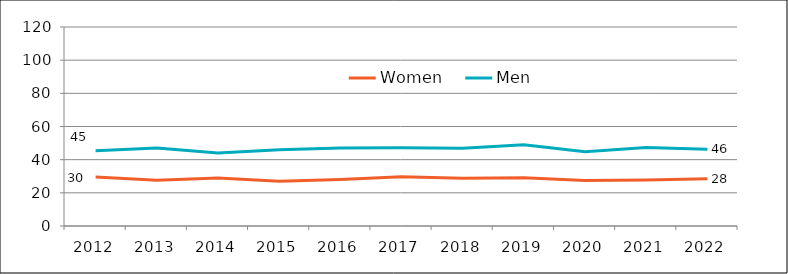
| Category | Women | Men |
|---|---|---|
| 2012.0 | 29.512 | 45.383 |
| 2013.0 | 27.587 | 47.069 |
| 2014.0 | 29 | 44 |
| 2015.0 | 27 | 46 |
| 2016.0 | 28 | 47 |
| 2017.0 | 29.714 | 47.166 |
| 2018.0 | 28.82 | 46.918 |
| 2019.0 | 29.061 | 48.94 |
| 2020.0 | 27.41 | 44.788 |
| 2021.0 | 27.77 | 47.28 |
| 2022.0 | 28.479 | 46.223 |